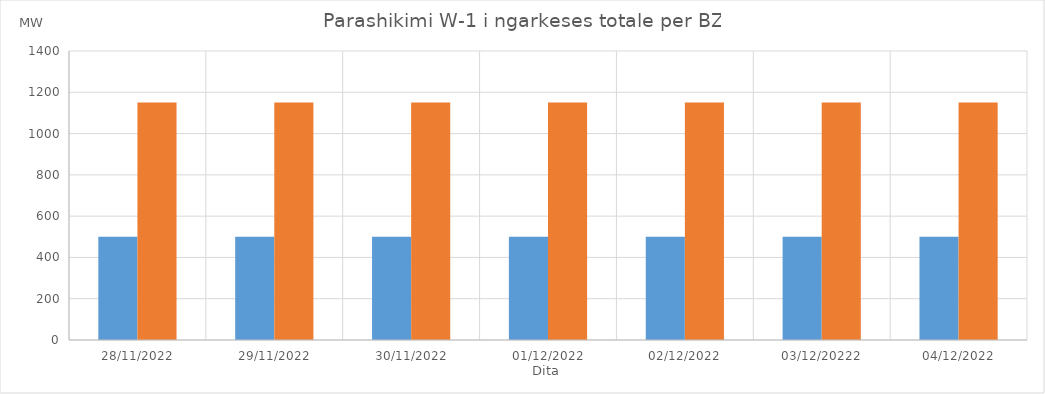
| Category | Min (MW) | Max (MW) |
|---|---|---|
| 28/11/2022 | 500 | 1150 |
| 29/11/2022 | 500 | 1150 |
| 30/11/2022 | 500 | 1150 |
| 01/12/2022 | 500 | 1150 |
| 02/12/2022 | 500 | 1150 |
| 03/12/20222 | 500 | 1150 |
| 04/12/2022 | 500 | 1150 |